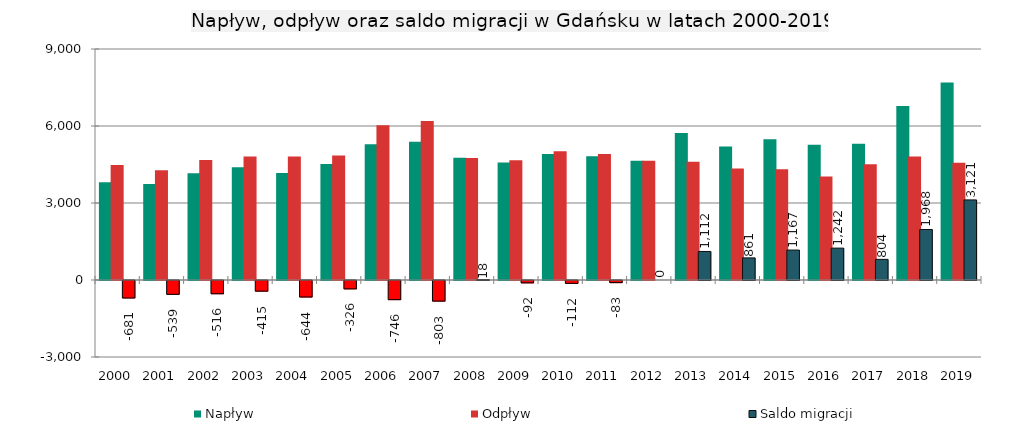
| Category | Napływ | Odpływ | Saldo migracji |
|---|---|---|---|
| 2000.0 | 3804 | 4485 | -681 |
| 2001.0 | 3738 | 4277 | -539 |
| 2002.0 | 4155 | 4671 | -516 |
| 2003.0 | 4394 | 4809 | -415 |
| 2004.0 | 4172 | 4816 | -644 |
| 2005.0 | 4520 | 4846 | -326 |
| 2006.0 | 5286 | 6032 | -746 |
| 2007.0 | 5390 | 6193 | -803 |
| 2008.0 | 4767 | 4749 | 18 |
| 2009.0 | 4577 | 4669 | -92 |
| 2010.0 | 4905 | 5017 | -112 |
| 2011.0 | 4822 | 4905 | -83 |
| 2012.0 | 4647 | 4647 | 0 |
| 2013.0 | 5723 | 4611 | 1112 |
| 2014.0 | 5204 | 4343 | 861 |
| 2015.0 | 5480 | 4313 | 1167 |
| 2016.0 | 5271 | 4029 | 1242 |
| 2017.0 | 5309 | 4505 | 804 |
| 2018.0 | 6781 | 4813 | 1968 |
| 2019.0 | 7691 | 4570 | 3121 |